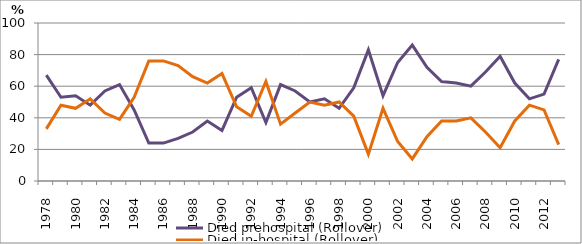
| Category | Died prehospital (Rollover) | Died in-hospital (Rollover) |
|---|---|---|
| 1978.0 | 67 | 33 |
| 1979.0 | 53 | 48 |
| 1980.0 | 54 | 46 |
| 1981.0 | 48 | 52 |
| 1982.0 | 57 | 43 |
| 1983.0 | 61 | 39 |
| 1984.0 | 45 | 53 |
| 1985.0 | 24 | 76 |
| 1986.0 | 24 | 76 |
| 1987.0 | 27 | 73 |
| 1988.0 | 31 | 66 |
| 1989.0 | 38 | 62 |
| 1990.0 | 32 | 68 |
| 1991.0 | 53 | 47 |
| 1992.0 | 59 | 41 |
| 1993.0 | 37 | 63 |
| 1994.0 | 61 | 36 |
| 1995.0 | 57 | 43 |
| 1996.0 | 50 | 50 |
| 1997.0 | 52 | 48 |
| 1998.0 | 46 | 50 |
| 1999.0 | 59 | 41 |
| 2000.0 | 83 | 17 |
| 2001.0 | 54 | 46 |
| 2002.0 | 75 | 25 |
| 2003.0 | 86 | 14 |
| 2004.0 | 72 | 28 |
| 2005.0 | 63 | 38 |
| 2006.0 | 62 | 38 |
| 2007.0 | 60 | 40 |
| 2008.0 | 69 | 31 |
| 2009.0 | 79 | 21 |
| 2010.0 | 62 | 38 |
| 2011.0 | 52 | 48 |
| 2012.0 | 55 | 45 |
| 2013.0 | 77 | 23 |